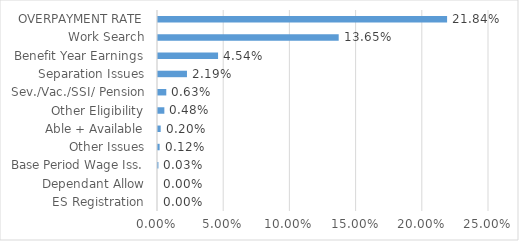
| Category | Series 0 |
|---|---|
| ES Registration | 0 |
| Dependant Allow | 0 |
| Base Period Wage Iss. | 0 |
| Other Issues | 0.001 |
| Able + Available | 0.002 |
| Other Eligibility | 0.005 |
| Sev./Vac./SSI/ Pension | 0.006 |
| Separation Issues | 0.022 |
| Benefit Year Earnings | 0.045 |
| Work Search | 0.136 |
| OVERPAYMENT RATE | 0.218 |